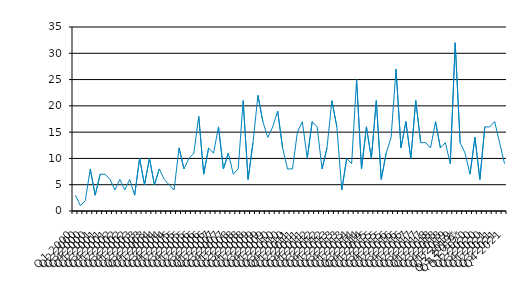
| Category | Series 0 |
|---|---|
| Q1 2000 | 3 |
| Q2 2000 | 1 |
| Q3 2000 | 2 |
| Q4 2000 | 8 |
| Q1 2001 | 3 |
| Q2 2001 | 7 |
| Q3 2001 | 7 |
| Q4 2001 | 6 |
| Q1 2002 | 4 |
| Q2 2002 | 6 |
| Q3 2002 | 4 |
| Q4 2002 | 6 |
| Q1 2003 | 3 |
| Q2 2003 | 10 |
| Q3 2003 | 5 |
| Q4 2003 | 10 |
| Q1 2004 | 5 |
| Q2 2004 | 8 |
| Q3 2004 | 6 |
| Q4 2004 | 5 |
| Q1 2005 | 4 |
| Q2 2005 | 12 |
| Q3 2005 | 8 |
| Q4 2005 | 10 |
| Q1 2006 | 11 |
| Q2 2006 | 18 |
| Q3 2006 | 7 |
| Q4 2006 | 12 |
| Q1 2007 | 11 |
| Q2 2007 | 16 |
| Q3 2007 | 8 |
| Q4 2007 | 11 |
| Q1 2008 | 7 |
| Q2 2008 | 8 |
| Q3 2008 | 21 |
| Q4 2008 | 6 |
| Q1 2009 | 13 |
| Q2 2009 | 22 |
| Q3 2009 | 17 |
| Q4 2009 | 14 |
| Q1 2010 | 16 |
| Q2 2010 | 19 |
| Q3 2010 | 12 |
| Q4 2010 | 8 |
| Q1 2011 | 8 |
| Q2 2011 | 15 |
| Q3 2011 | 17 |
| Q4 2011 | 10 |
| Q1 2012 | 17 |
| Q2 2012 | 16 |
| Q3 2012 | 8 |
| Q4 2012 | 12 |
| Q1 2013 | 21 |
| Q2 2013 | 16 |
| Q3 2013 | 4 |
| Q4 2013 | 10 |
| Q1 2014 | 9 |
| Q2 2014 | 25 |
| Q3 2014 | 8 |
| Q4 2014 | 16 |
| Q1 2015 | 10 |
| Q2 2015 | 21 |
| Q3 2015 | 6 |
| Q4 2015 | 11 |
| Q1 2016 | 14 |
| Q2 2016 | 27 |
| Q3 2016 | 12 |
| Q4 2016 | 17 |
| Q1 2017 | 10 |
| Q2 2017 | 21 |
| Q3 2017 | 13 |
| Q4 2017 | 13 |
| Q1 2018 | 12 |
| Q2 2018 | 17 |
| Q3 2018 | 12 |
| Q4 2018 | 13 |
| Q1 2019 | 9 |
| Q2 2019 | 32 |
| Q3 2019* | 13 |
| Q4 2019* | 11 |
| Q1 2020 | 7 |
| Q2 2020 | 14 |
| Q3 2020 | 6 |
| Q4 2020 | 16 |
| Q1 2021 | 16 |
| Q2 2021 | 17 |
| Q3 2021 | 13 |
| Q4 2021 | 9 |